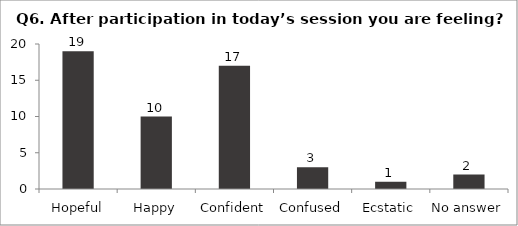
| Category | Q6. After participation in today’s session you are feeling? |
|---|---|
| Hopeful | 19 |
| Happy | 10 |
| Confident | 17 |
| Confused | 3 |
| Ecstatic | 1 |
| No answer | 2 |